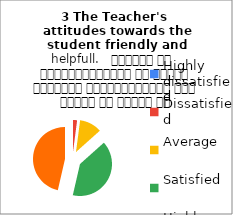
| Category | 3 The Teacher's 
attitudes towards the student friendly and helpfull.   शिक्षक का विद्यार्थियों के प्रति व्यवहार मित्रतापूर्ण एवम सहयोग के भावना से परिपूर्ण था |
|---|---|
| Highly dissatisfied | 0 |
| Dissatisfied | 2 |
| Average | 11 |
| Satisfied | 39 |
| Highly satisfied | 45 |